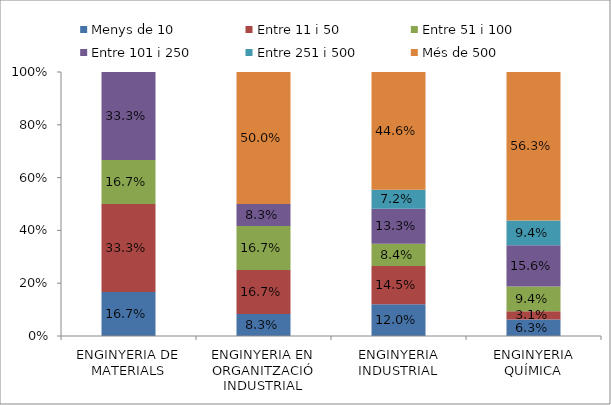
| Category | Menys de 10 | Entre 11 i 50 | Entre 51 i 100 | Entre 101 i 250 | Entre 251 i 500 | Més de 500 |
|---|---|---|---|---|---|---|
| ENGINYERIA DE MATERIALS | 0.167 | 0.333 | 0.167 | 0.333 | 0 | 0 |
| ENGINYERIA EN ORGANITZACIÓ INDUSTRIAL | 0.083 | 0.167 | 0.167 | 0.083 | 0 | 0.5 |
| ENGINYERIA INDUSTRIAL | 0.12 | 0.145 | 0.084 | 0.133 | 0.072 | 0.446 |
| ENGINYERIA QUÍMICA | 0.062 | 0.031 | 0.094 | 0.156 | 0.094 | 0.562 |